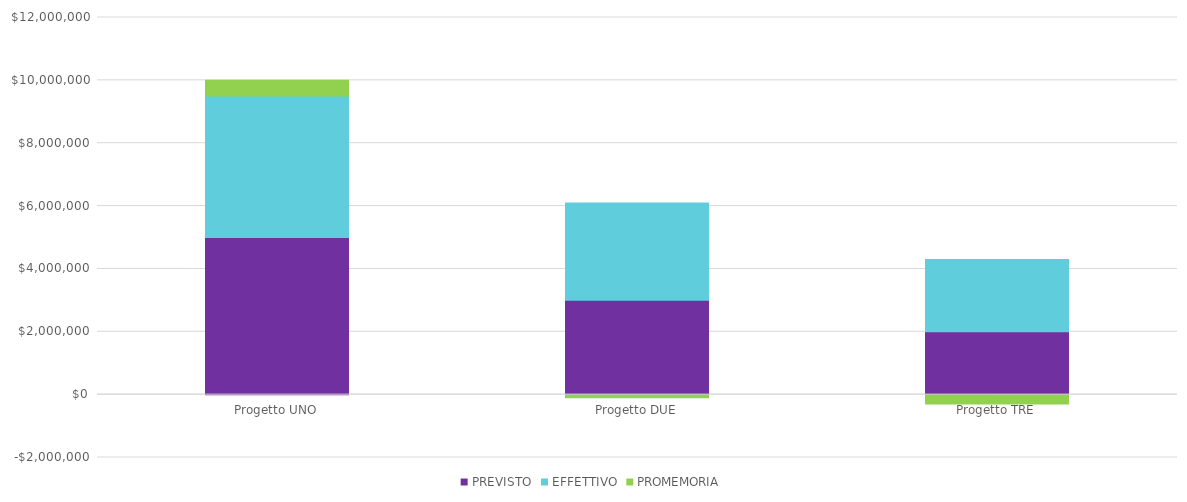
| Category | PREVISTO | EFFETTIVO | PROMEMORIA |
|---|---|---|---|
| Progetto UNO | 5000000 | 4500000 | 500000 |
| Progetto DUE | 3000000 | 3100000 | -100000 |
| Progetto TRE | 2000000 | 2300000 | -300000 |